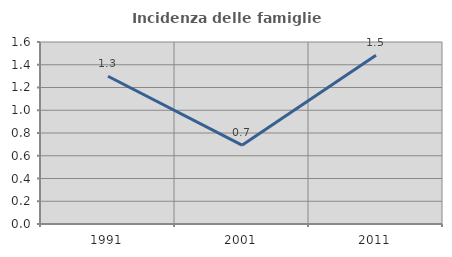
| Category | Incidenza delle famiglie numerose |
|---|---|
| 1991.0 | 1.299 |
| 2001.0 | 0.693 |
| 2011.0 | 1.483 |